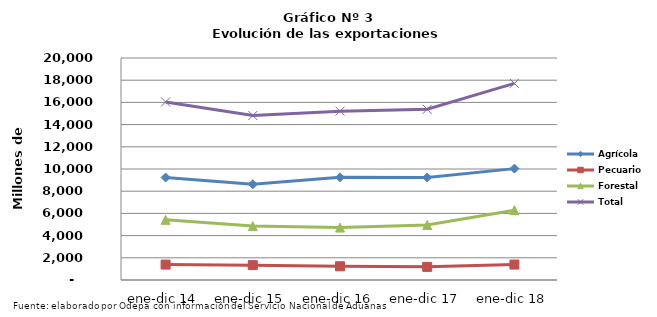
| Category | Agrícola | Pecuario | Forestal | Total |
|---|---|---|---|---|
| ene-dic 14 | 9232765 | 1387980 | 5422471 | 16043216 |
| ene-dic 15 | 8623933 | 1338945 | 4854159 | 14817037 |
| ene-dic 16 | 9248681 | 1236616 | 4722907 | 15208204 |
| ene-dic 17 | 9235988 | 1182554 | 4960800 | 15379342 |
| ene-dic 18 | 10033905 | 1390583 | 6292799 | 17717287 |